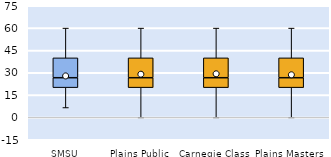
| Category | 25th | 50th | 75th |
|---|---|---|---|
| SMSU | 20 | 6.667 | 13.333 |
| Plains Public | 20 | 6.667 | 13.333 |
| Carnegie Class | 20 | 6.667 | 13.333 |
| Plains Masters | 20 | 6.667 | 13.333 |